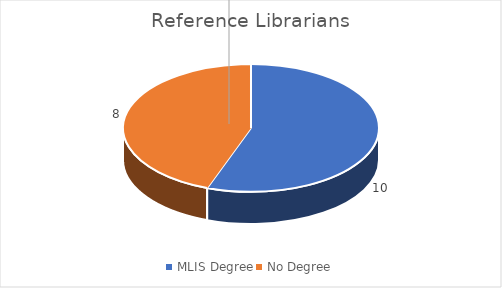
| Category | Series 0 |
|---|---|
| MLIS Degree | 10 |
| No Degree | 8 |